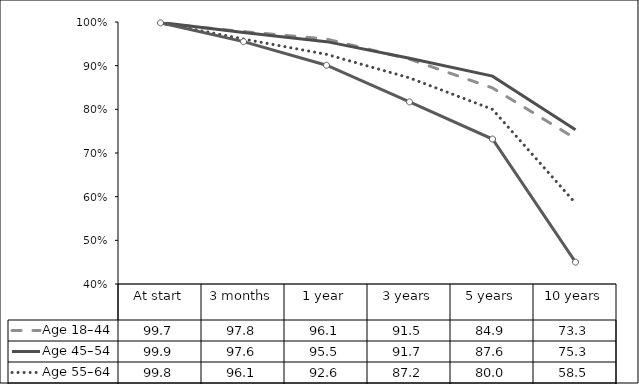
| Category | Age 18–44  | Age 45–54  | Age 55–64  | Age 65+  |
|---|---|---|---|---|
| At start | 99.7 | 99.9 | 99.8 | 99.8 |
| 3 months | 97.8 | 97.6 | 96.1 | 95.5 |
| 1 year | 96.1 | 95.5 | 92.6 | 90.1 |
| 3 years | 91.5 | 91.7 | 87.2 | 81.7 |
| 5 years | 84.9 | 87.6 | 80 | 73.2 |
| 10 years | 73.3 | 75.3 | 58.5 | 45 |